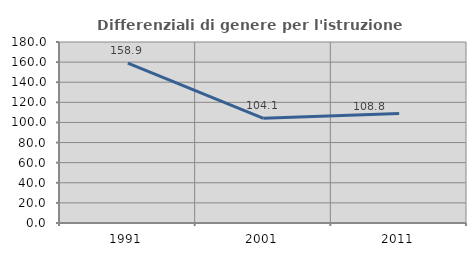
| Category | Differenziali di genere per l'istruzione superiore |
|---|---|
| 1991.0 | 158.923 |
| 2001.0 | 104.084 |
| 2011.0 | 108.845 |